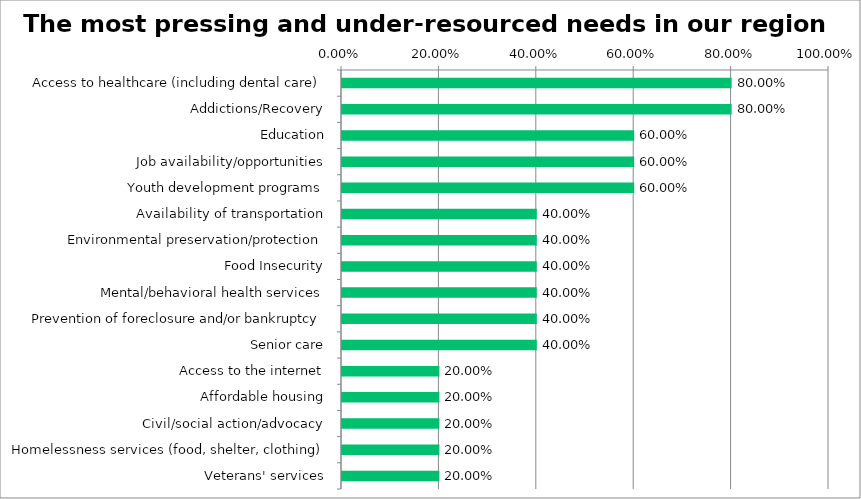
| Category | Responses |
|---|---|
| Access to healthcare (including dental care) | 0.8 |
| Addictions/Recovery | 0.8 |
| Education | 0.6 |
| Job availability/opportunities | 0.6 |
| Youth development programs | 0.6 |
| Availability of transportation | 0.4 |
| Environmental preservation/protection | 0.4 |
| Food Insecurity | 0.4 |
| Mental/behavioral health services | 0.4 |
| Prevention of foreclosure and/or bankruptcy | 0.4 |
| Senior care | 0.4 |
| Access to the internet | 0.2 |
| Affordable housing | 0.2 |
| Civil/social action/advocacy | 0.2 |
| Homelessness services (food, shelter, clothing) | 0.2 |
| Veterans' services | 0.2 |